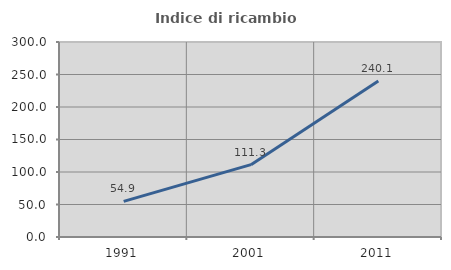
| Category | Indice di ricambio occupazionale  |
|---|---|
| 1991.0 | 54.897 |
| 2001.0 | 111.264 |
| 2011.0 | 240.068 |